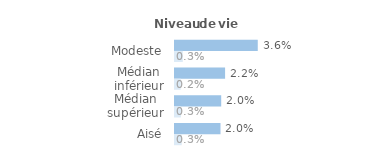
| Category | Series 1 | Series 0 |
|---|---|---|
| Modeste | 0.036 | 0.003 |
| Médian inférieur | 0.022 | 0.002 |
| Médian supérieur | 0.02 | 0.003 |
| Aisé | 0.02 | 0.003 |